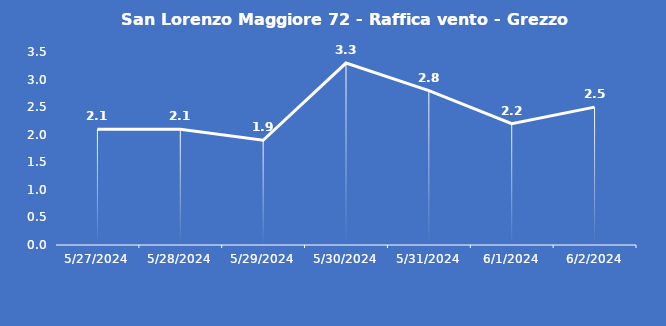
| Category | San Lorenzo Maggiore 72 - Raffica vento - Grezzo (m/s) |
|---|---|
| 5/27/24 | 2.1 |
| 5/28/24 | 2.1 |
| 5/29/24 | 1.9 |
| 5/30/24 | 3.3 |
| 5/31/24 | 2.8 |
| 6/1/24 | 2.2 |
| 6/2/24 | 2.5 |